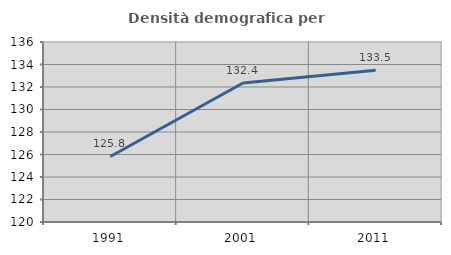
| Category | Densità demografica |
|---|---|
| 1991.0 | 125.826 |
| 2001.0 | 132.359 |
| 2011.0 | 133.479 |